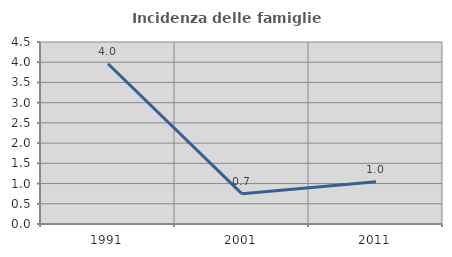
| Category | Incidenza delle famiglie numerose |
|---|---|
| 1991.0 | 3.963 |
| 2001.0 | 0.745 |
| 2011.0 | 1.047 |